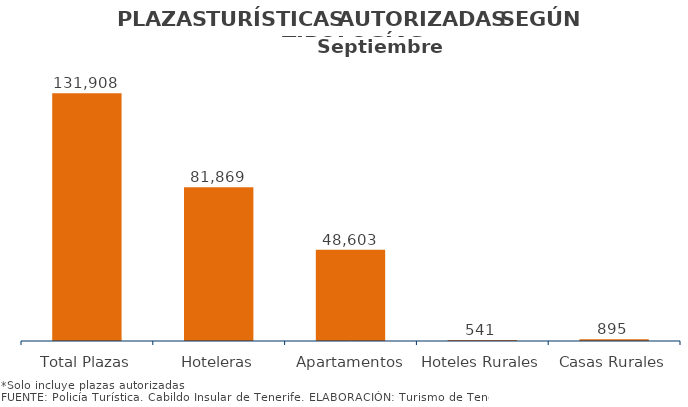
| Category | PLAZAS TURISTICAS AUTORIZADAS SEGÚN TIPOLOGÍA DEL ESTABLECIMIENTO.
Municipios e Isla Septiembre 2014 |
|---|---|
| Total Plazas | 131908 |
| Hoteleras | 81869 |
| Apartamentos | 48603 |
| Hoteles Rurales | 541 |
| Casas Rurales | 895 |